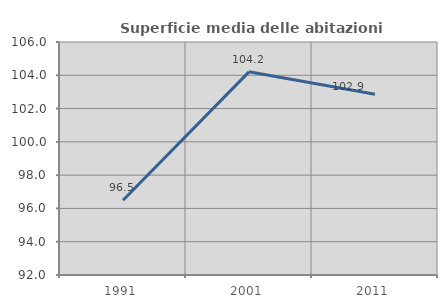
| Category | Superficie media delle abitazioni occupate |
|---|---|
| 1991.0 | 96.489 |
| 2001.0 | 104.207 |
| 2011.0 | 102.859 |